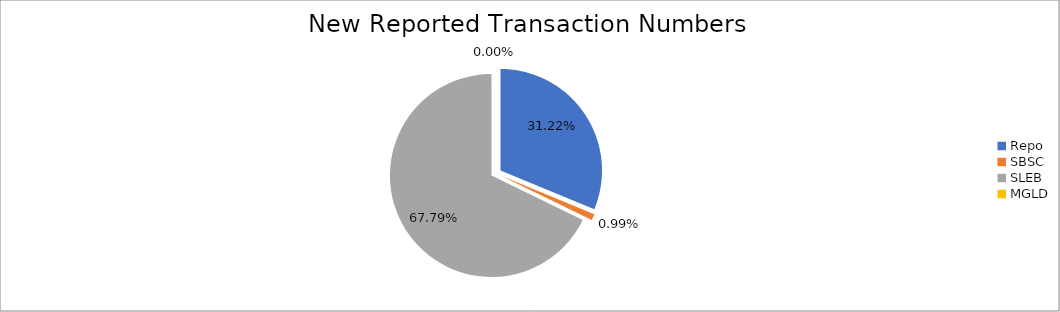
| Category | Series 0 |
|---|---|
| Repo | 310042 |
| SBSC | 9874 |
| SLEB | 673273 |
| MGLD | 25 |